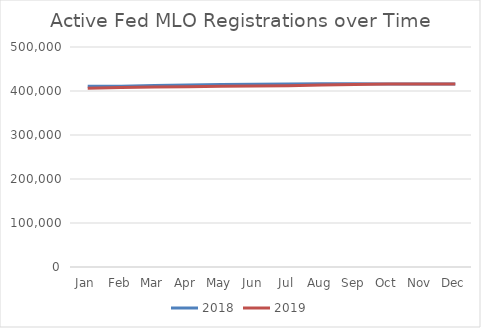
| Category | 2018 | 2019 |
|---|---|---|
| Jan | 410840 | 406114 |
| Feb | 410744 | 407824 |
| Mar | 412617 | 409027 |
| Apr | 413414 | 409388 |
| May | 414497 | 410915 |
| Jun | 415198 | 411525 |
| Jul | 415689 | 412040 |
| Aug | 416331 | 413519 |
| Sep | 416493 | 414588 |
| Oct | 416188 | 415712 |
| Nov | 415746 | 416127 |
| Dec | 416124 | 416184 |